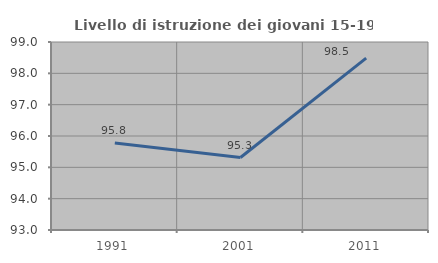
| Category | Livello di istruzione dei giovani 15-19 anni |
|---|---|
| 1991.0 | 95.775 |
| 2001.0 | 95.312 |
| 2011.0 | 98.485 |